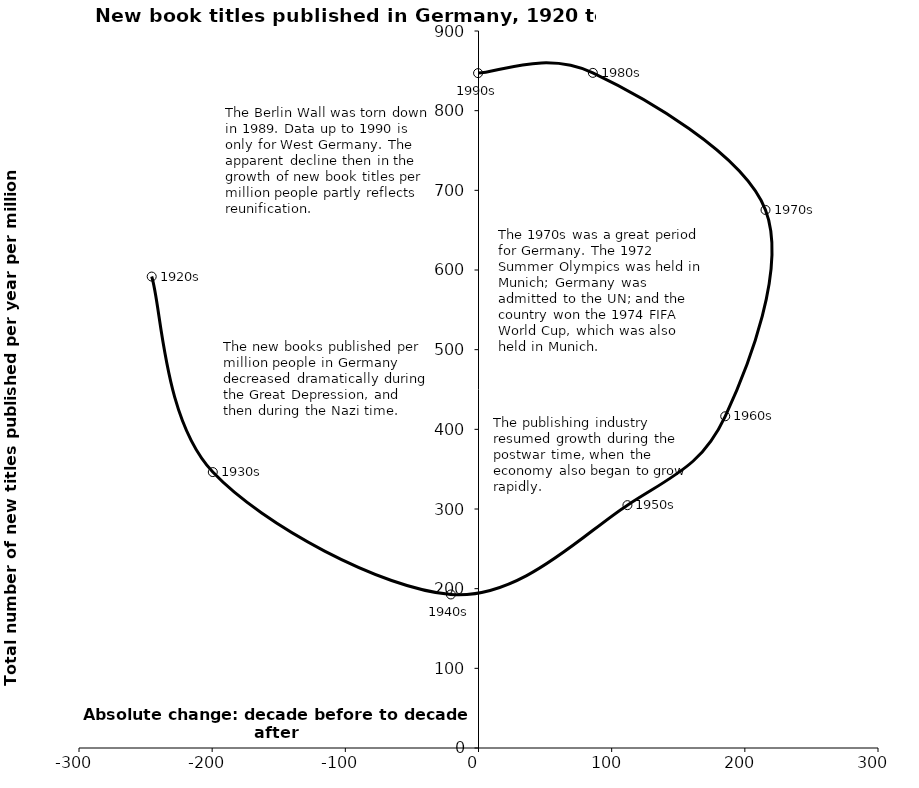
| Category | Series 0 |
|---|---|
| -245.40361096677378 | 591.756 |
| -199.5178869434083 | 346.352 |
| -20.755825933337974 | 192.72 |
| 111.83847871770507 | 304.841 |
| 185.27115565755858 | 416.397 |
| 215.52444005718172 | 675.383 |
| 85.87301808822411 | 847.446 |
| -0.3169790048413006 | 847.129 |